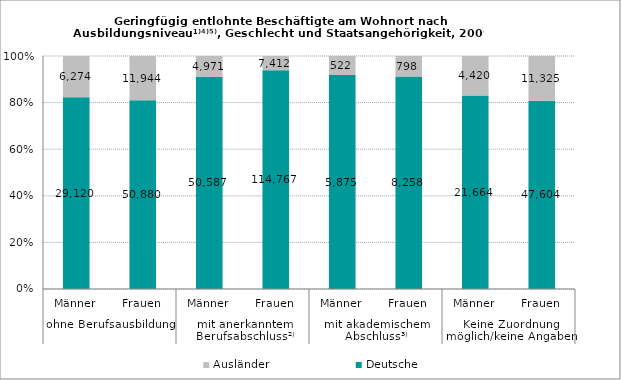
| Category | Deutsche | Ausländer |
|---|---|---|
| 0 | 29120 | 6274 |
| 1 | 50880 | 11944 |
| 2 | 50587 | 4971 |
| 3 | 114767 | 7412 |
| 4 | 5875 | 522 |
| 5 | 8258 | 798 |
| 6 | 21664 | 4420 |
| 7 | 47604 | 11325 |